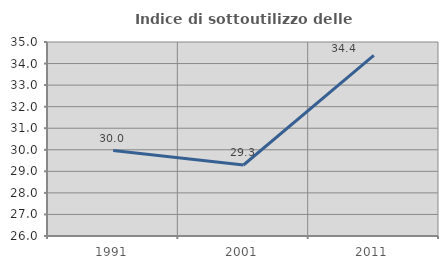
| Category | Indice di sottoutilizzo delle abitazioni  |
|---|---|
| 1991.0 | 29.963 |
| 2001.0 | 29.293 |
| 2011.0 | 34.375 |